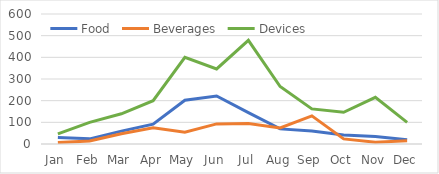
| Category | Food | Beverages | Devices |
|---|---|---|---|
| Jan | 30.43 | 6.49 | 46.47 |
| Feb | 23.72 | 14.07 | 99.99 |
| Mar | 59.33 | 47.66 | 139.41 |
| Apr | 91.44 | 75.04 | 199.98 |
| May | 202.16 | 54.86 | 399.97 |
| Jun | 221.72 | 92.86 | 346.46 |
| Jul | 144.57 | 94.51 | 478.38 |
| Aug | 69.73 | 73.95 | 265.46 |
| Sep | 59.65 | 129.85 | 161.95 |
| Oct | 41.28 | 23.45 | 146.47 |
| Nov | 34.89 | 7.58 | 215.48 |
| Dec | 19.56 | 15.16 | 99.98 |